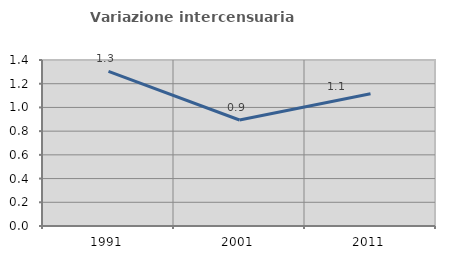
| Category | Variazione intercensuaria annua |
|---|---|
| 1991.0 | 1.304 |
| 2001.0 | 0.894 |
| 2011.0 | 1.115 |